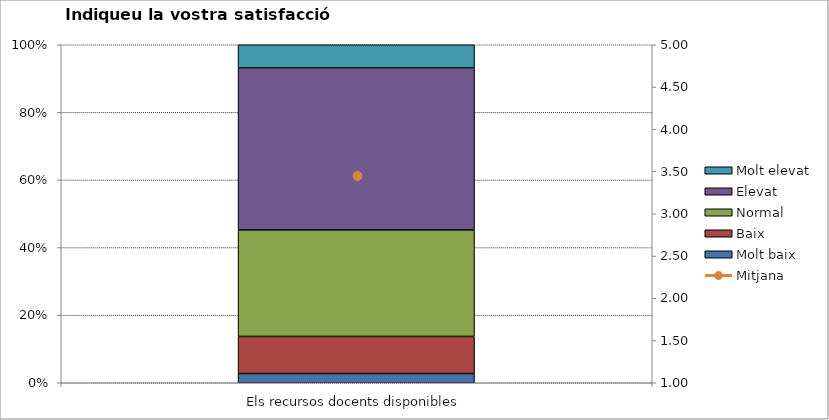
| Category | Molt baix | Baix | Normal  | Elevat | Molt elevat |
|---|---|---|---|---|---|
| Els recursos docents disponibles | 2 | 8 | 23 | 35 | 5 |